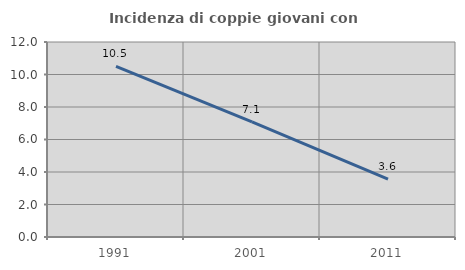
| Category | Incidenza di coppie giovani con figli |
|---|---|
| 1991.0 | 10.5 |
| 2001.0 | 7.083 |
| 2011.0 | 3.558 |